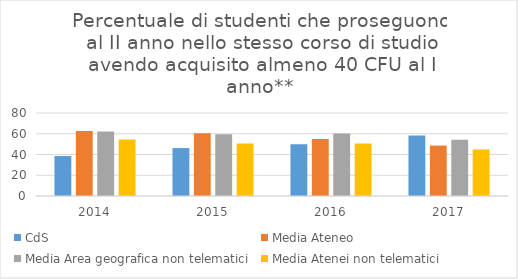
| Category | CdS | Media Ateneo | Media Area geografica non telematici | Media Atenei non telematici |
|---|---|---|---|---|
| 2014.0 | 38.5 | 62.7 | 62.1 | 54.4 |
| 2015.0 | 46.2 | 60.5 | 59.6 | 50.5 |
| 2016.0 | 50 | 55 | 60.2 | 50.6 |
| 2017.0 | 58.3 | 48.6 | 54.3 | 44.9 |